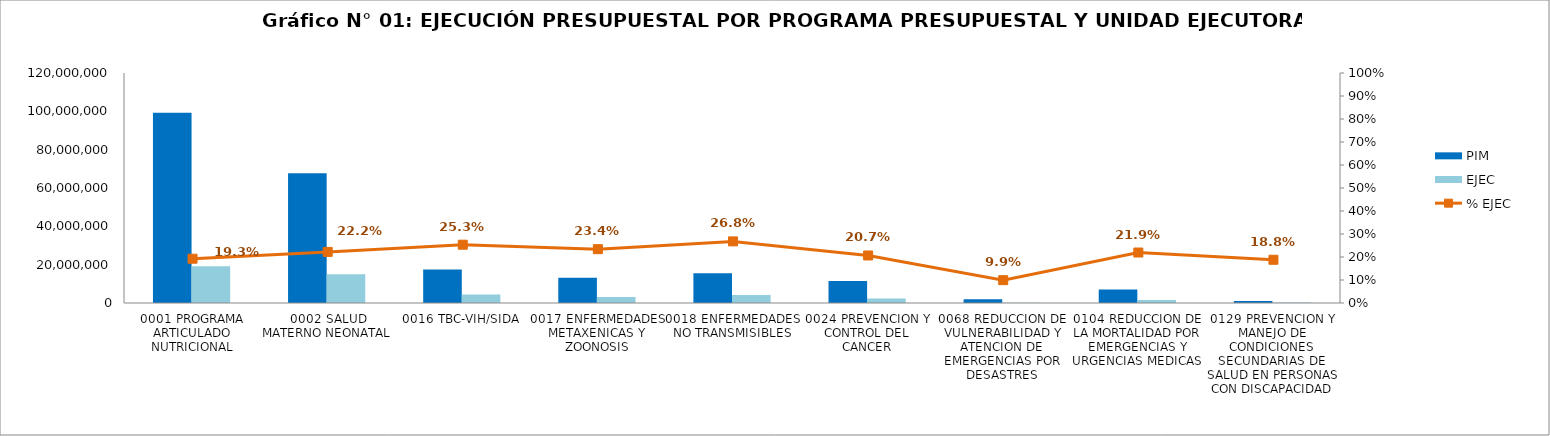
| Category | PIM | EJEC |
|---|---|---|
| 0001 PROGRAMA ARTICULADO NUTRICIONAL | 99239267 | 19109137 |
| 0002 SALUD MATERNO NEONATAL | 67667016 | 15028643 |
| 0016 TBC-VIH/SIDA | 17487184 | 4432120 |
| 0017 ENFERMEDADES METAXENICAS Y ZOONOSIS | 13218495 | 3092991 |
| 0018 ENFERMEDADES NO TRANSMISIBLES | 15574087 | 4172050 |
| 0024 PREVENCION Y CONTROL DEL CANCER | 11496618 | 2375108 |
| 0068 REDUCCION DE VULNERABILIDAD Y ATENCION DE EMERGENCIAS POR DESASTRES | 1930100 | 191575 |
| 0104 REDUCCION DE LA MORTALIDAD POR EMERGENCIAS Y URGENCIAS MEDICAS | 7050921 | 1547265 |
| 0129 PREVENCION Y MANEJO DE CONDICIONES SECUNDARIAS DE SALUD EN PERSONAS CON DISCAPACIDAD | 1084602 | 203889 |